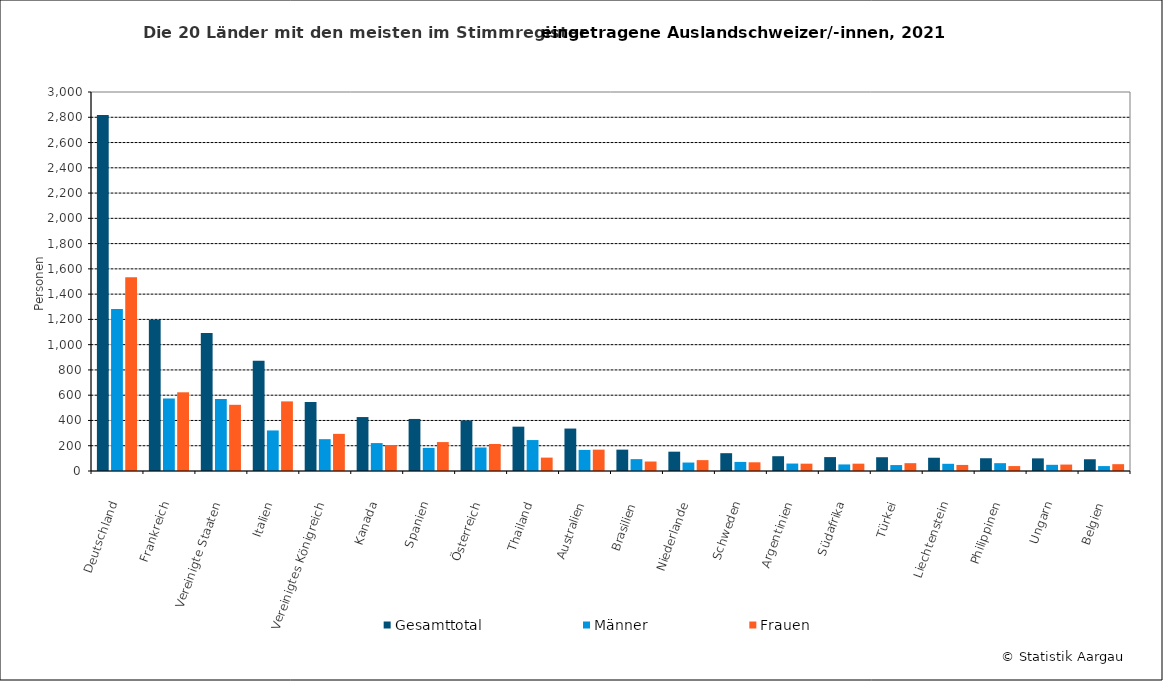
| Category | Gesamttotal | Männer | Frauen |
|---|---|---|---|
| Deutschland | 2817 | 1283 | 1534 |
| Frankreich | 1197 | 574 | 623 |
| Vereinigte Staaten | 1093 | 569 | 524 |
| Italien | 872 | 321 | 551 |
| Vereinigtes Königreich | 546 | 252 | 294 |
| Kanada | 427 | 221 | 206 |
| Spanien | 412 | 183 | 229 |
| Österreich | 400 | 186 | 214 |
| Thailand | 351 | 245 | 106 |
| Australien | 336 | 167 | 169 |
| Brasilien | 169 | 94 | 75 |
| Niederlande | 153 | 67 | 86 |
| Schweden | 141 | 72 | 69 |
| Argentinien | 117 | 59 | 58 |
| Südafrika | 110 | 52 | 58 |
| Türkei | 109 | 47 | 62 |
| Liechtenstein | 105 | 57 | 48 |
| Philippinen | 101 | 62 | 39 |
| Ungarn | 100 | 49 | 51 |
| Belgien | 93 | 39 | 54 |